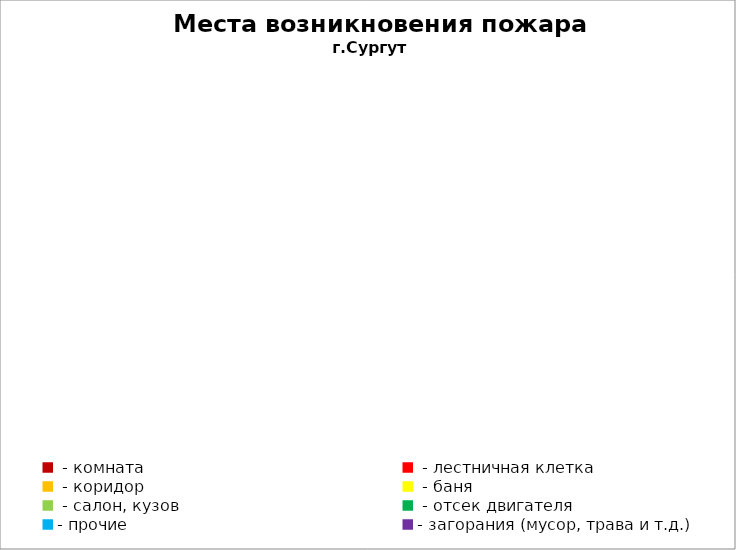
| Category | Места возникновения пожара |
|---|---|
|  - комната | 2 |
|  - лестничная клетка | 1 |
|  - коридор | 0 |
|  - баня | 1 |
|  - салон, кузов | 2 |
|  - отсек двигателя | 9 |
| - прочие | 20 |
| - загорания (мусор, трава и т.д.)  | 3 |